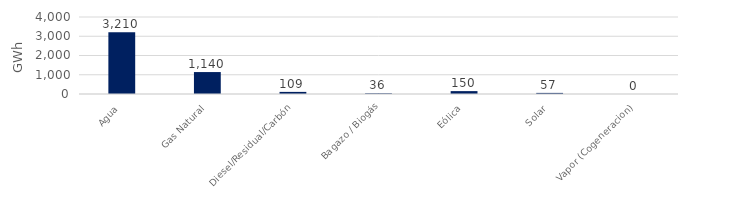
| Category | Series 0 |
|---|---|
| Agua | 3209.789 |
| Gas Natural | 1139.662 |
| Diesel/Residual/Carbón | 109.212 |
| Bagazo / Biogás | 35.976 |
| Eólica | 149.654 |
| Solar | 57.145 |
| Vapor (Cogeneracion) | 0.415 |